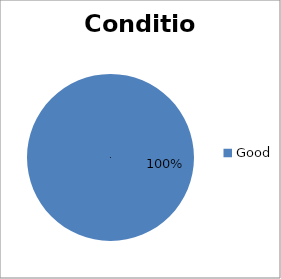
| Category | Condition |
|---|---|
| Good | 1 |